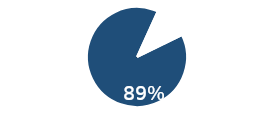
| Category | Chg |
|---|---|
| 0 | 0.89 |
| 1 | 0.11 |